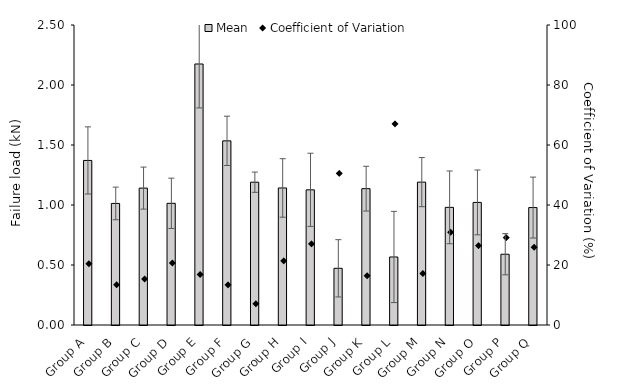
| Category | Mean |
|---|---|
| Group A | 1.371 |
| Group B | 1.013 |
| Group C | 1.141 |
| Group D | 1.014 |
| Group E | 2.175 |
| Group F | 1.535 |
| Group G | 1.19 |
| Group H | 1.142 |
| Group I | 1.126 |
| Group J | 0.472 |
| Group K | 1.136 |
| Group L | 0.567 |
| Group M | 1.191 |
| Group N | 0.98 |
| Group O | 1.022 |
| Group P | 0.59 |
| Group Q | 0.979 |